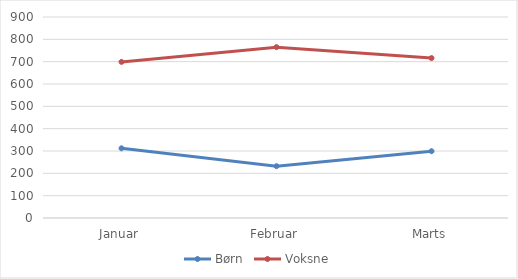
| Category | Børn | Voksne |
|---|---|---|
| Januar | 312 | 699 |
| Februar | 232 | 765 |
| Marts | 299 | 716 |